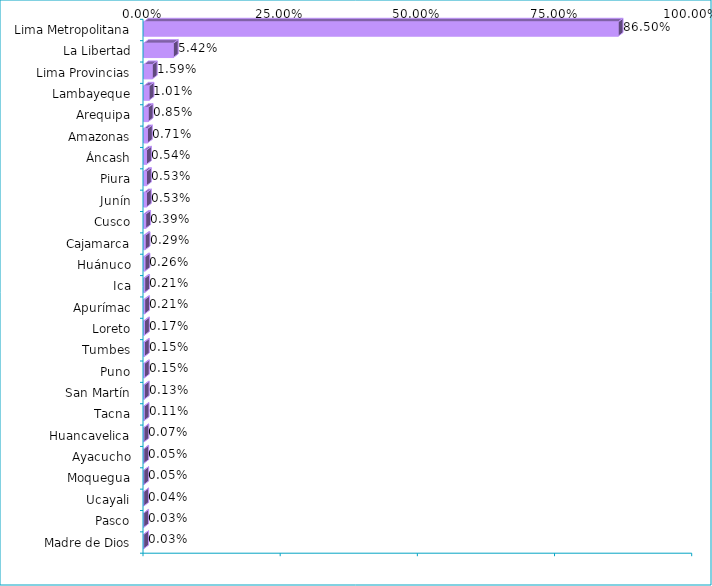
| Category | Series 0 |
|---|---|
| Lima Metropolitana | 0.865 |
| La Libertad | 0.054 |
| Lima Provincias | 0.016 |
| Lambayeque | 0.01 |
| Arequipa | 0.008 |
| Amazonas | 0.007 |
| Áncash | 0.005 |
| Piura | 0.005 |
| Junín | 0.005 |
| Cusco | 0.004 |
| Cajamarca | 0.003 |
| Huánuco | 0.003 |
| Ica | 0.002 |
| Apurímac | 0.002 |
| Loreto | 0.002 |
| Tumbes | 0.002 |
| Puno | 0.001 |
| San Martín | 0.001 |
| Tacna | 0.001 |
| Huancavelica | 0.001 |
| Ayacucho | 0 |
| Moquegua | 0 |
| Ucayali | 0 |
| Pasco | 0 |
| Madre de Dios | 0 |